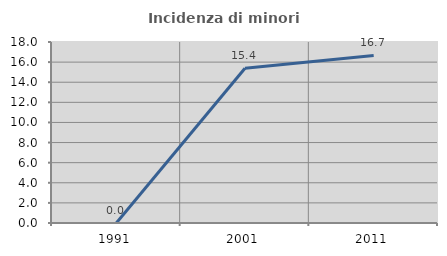
| Category | Incidenza di minori stranieri |
|---|---|
| 1991.0 | 0 |
| 2001.0 | 15.385 |
| 2011.0 | 16.667 |